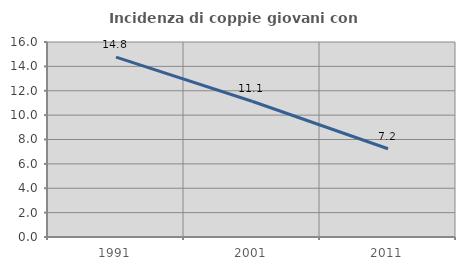
| Category | Incidenza di coppie giovani con figli |
|---|---|
| 1991.0 | 14.754 |
| 2001.0 | 11.135 |
| 2011.0 | 7.241 |